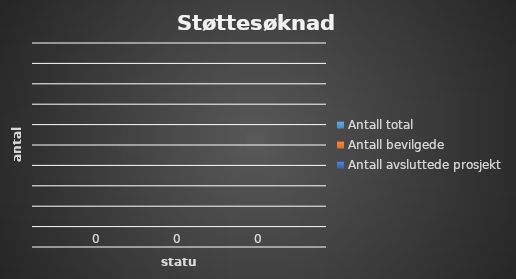
| Category | Antall total | Antall bevilgede | Antall avsluttede prosjekt |
|---|---|---|---|
| 0 | 0 | 0 | 0 |